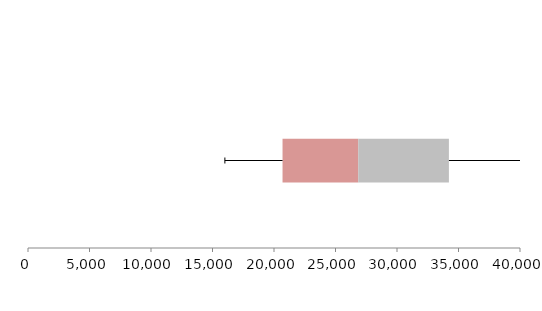
| Category | Series 1 | Series 2 | Series 3 |
|---|---|---|---|
| 0 | 20693.704 | 6156.19 | 7370.231 |